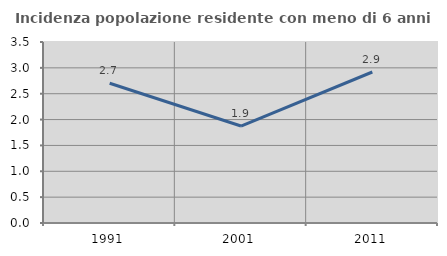
| Category | Incidenza popolazione residente con meno di 6 anni |
|---|---|
| 1991.0 | 2.703 |
| 2001.0 | 1.875 |
| 2011.0 | 2.92 |